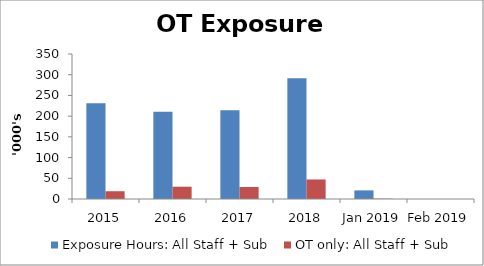
| Category | Exposure Hours: All Staff + Sub | OT only: All Staff + Sub |
|---|---|---|
| 2015 | 231066 | 18760 |
| 2016 | 210544 | 29652 |
| 2017 | 214425 | 28993 |
| 2018 | 291680 | 47142 |
| Jan 2019 | 20779 | 802 |
| Feb 2019 | 0 | 0 |